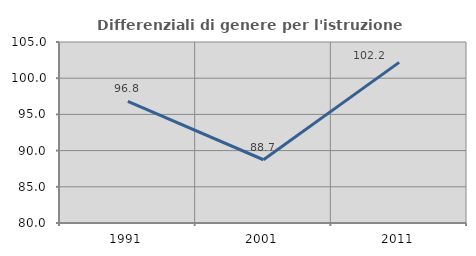
| Category | Differenziali di genere per l'istruzione superiore |
|---|---|
| 1991.0 | 96.784 |
| 2001.0 | 88.737 |
| 2011.0 | 102.188 |